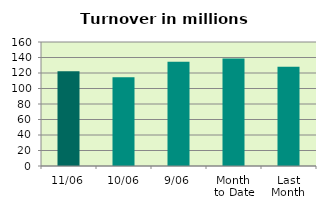
| Category | Series 0 |
|---|---|
| 11/06 | 122.219 |
| 10/06 | 114.399 |
| 9/06 | 134.493 |
| Month 
to Date | 138.578 |
| Last
Month | 127.932 |